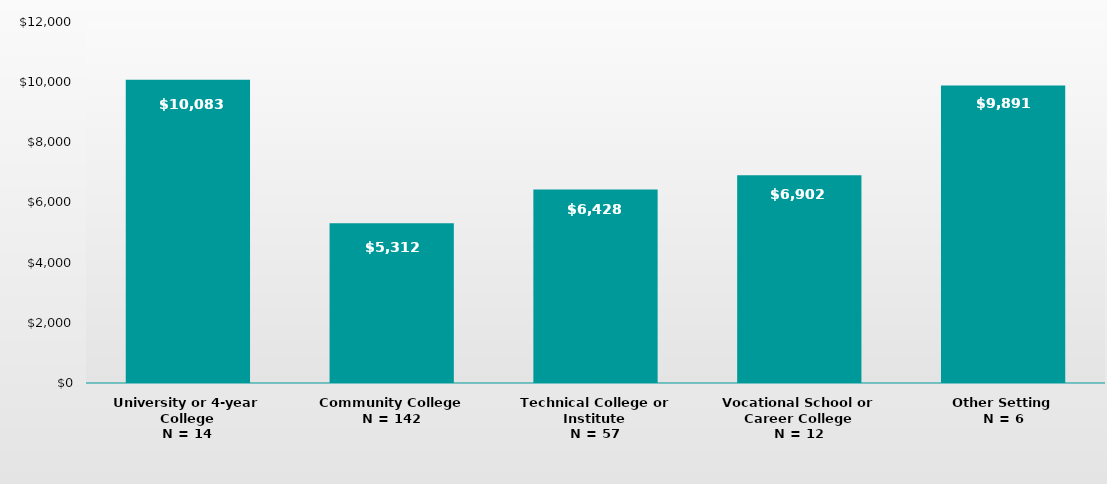
| Category | Series 0 |
|---|---|
| University or 4-year College
N = 14 | 10083 |
| Community College
N = 142 | 5312 |
| Technical College or Institute
N = 57 | 6428 |
| Vocational School or Career College
N = 12 | 6902 |
| Other Setting
N = 6 | 9891 |